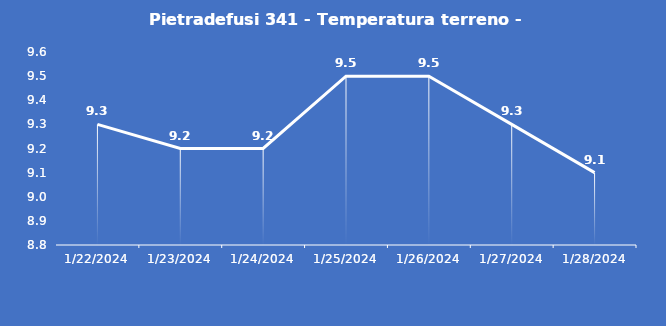
| Category | Pietradefusi 341 - Temperatura terreno - Grezzo (°C) |
|---|---|
| 1/22/24 | 9.3 |
| 1/23/24 | 9.2 |
| 1/24/24 | 9.2 |
| 1/25/24 | 9.5 |
| 1/26/24 | 9.5 |
| 1/27/24 | 9.3 |
| 1/28/24 | 9.1 |